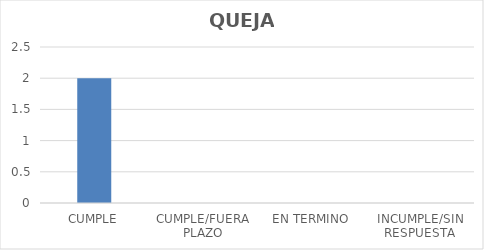
| Category | TOTAL |
|---|---|
| CUMPLE | 2 |
| CUMPLE/FUERA PLAZO | 0 |
| EN TERMINO | 0 |
| INCUMPLE/SIN RESPUESTA | 0 |